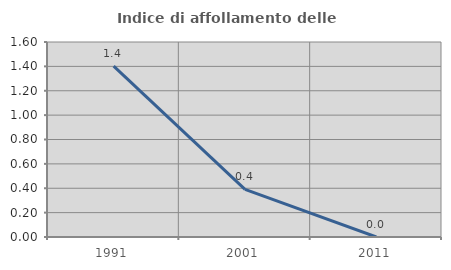
| Category | Indice di affollamento delle abitazioni  |
|---|---|
| 1991.0 | 1.402 |
| 2001.0 | 0.391 |
| 2011.0 | 0 |